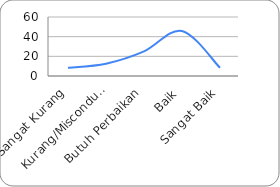
| Category | Pola Distribusi |
|---|---|
| Sangat Kurang | 8.333 |
| Kurang/Misconduct | 12.5 |
| Butuh Perbaikan | 25 |
| Baik | 45.833 |
| Sangat Baik | 8.333 |